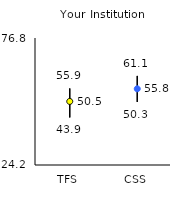
| Category | 25th | 75th | Mean |
|---|---|---|---|
| TFS | 43.9 | 55.9 | 50.53 |
| CSS | 50.3 | 61.1 | 55.76 |